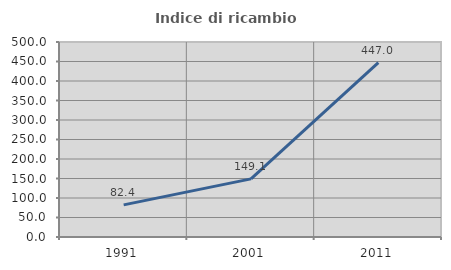
| Category | Indice di ricambio occupazionale  |
|---|---|
| 1991.0 | 82.427 |
| 2001.0 | 149.091 |
| 2011.0 | 447 |